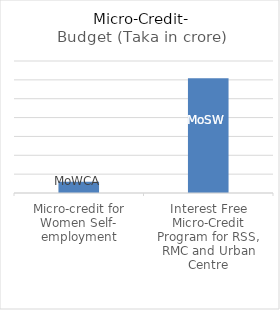
| Category | Budget (Taka in crore) |
|---|---|
| Micro-credit for Women Self-
employment | 6 |
| Interest Free Micro-Credit Program for RSS, RMC and Urban
Centre | 60.82 |